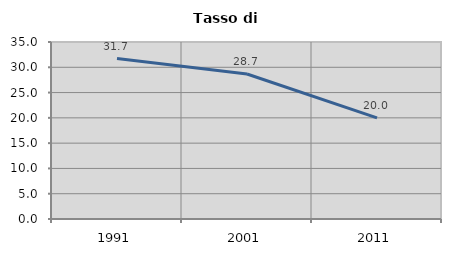
| Category | Tasso di disoccupazione   |
|---|---|
| 1991.0 | 31.715 |
| 2001.0 | 28.674 |
| 2011.0 | 20 |